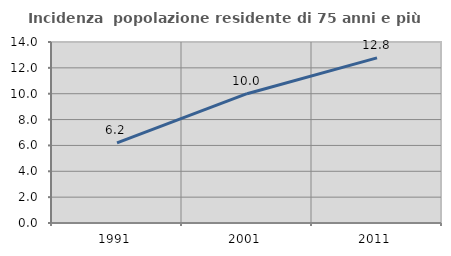
| Category | Incidenza  popolazione residente di 75 anni e più |
|---|---|
| 1991.0 | 6.194 |
| 2001.0 | 10 |
| 2011.0 | 12.776 |